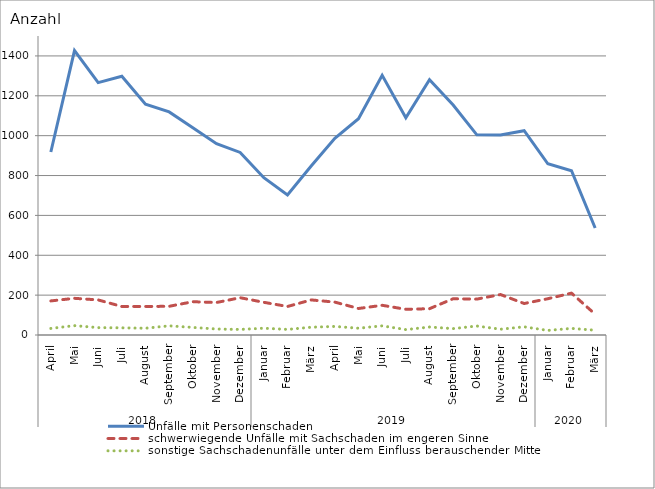
| Category | Unfälle mit Personenschaden | schwerwiegende Unfälle mit Sachschaden im engeren Sinne | sonstige Sachschadenunfälle unter dem Einfluss berauschender Mittel |
|---|---|---|---|
| 0 | 918 | 171 | 33 |
| 1 | 1427 | 184 | 47 |
| 2 | 1266 | 176 | 37 |
| 3 | 1298 | 143 | 36 |
| 4 | 1158 | 143 | 34 |
| 5 | 1119 | 144 | 46 |
| 6 | 1040 | 167 | 38 |
| 7 | 960 | 163 | 30 |
| 8 | 916 | 187 | 28 |
| 9 | 789 | 164 | 34 |
| 10 | 702 | 143 | 28 |
| 11 | 848 | 176 | 39 |
| 12 | 987 | 165 | 43 |
| 13 | 1085 | 133 | 34 |
| 14 | 1303 | 149 | 46 |
| 15 | 1090 | 129 | 27 |
| 16 | 1281 | 132 | 40 |
| 17 | 1154 | 182 | 32 |
| 18 | 1004 | 180 | 45 |
| 19 | 1003 | 203 | 29 |
| 20 | 1025 | 158 | 41 |
| 21 | 859 | 182 | 23 |
| 22 | 824 | 210 | 33 |
| 23 | 537 | 104 | 24 |